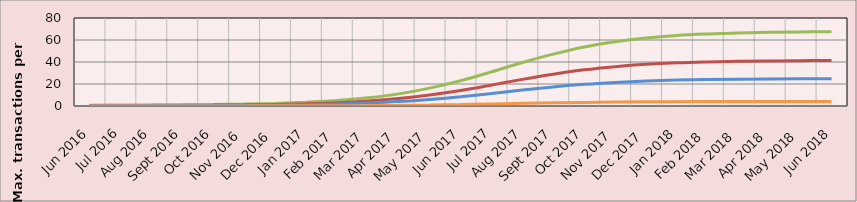
| Category | SUP A TPS | SUP B TPS | SUP C TPS | SUP D TPS |
|---|---|---|---|---|
| 2016-06-01 | 0.728 | 0.445 | 0.267 | 0.045 |
| 2016-07-01 | 0.864 | 0.529 | 0.317 | 0.053 |
| 2016-08-01 | 0.954 | 0.584 | 0.351 | 0.058 |
| 2016-09-01 | 1.098 | 0.672 | 0.403 | 0.067 |
| 2016-10-01 | 1.342 | 0.822 | 0.493 | 0.082 |
| 2016-11-01 | 1.728 | 1.058 | 0.635 | 0.106 |
| 2016-12-01 | 2.377 | 1.455 | 0.873 | 0.146 |
| 2017-01-01 | 3.429 | 2.099 | 1.259 | 0.21 |
| 2017-02-01 | 4.909 | 3.006 | 1.803 | 0.301 |
| 2017-03-01 | 7.412 | 4.538 | 2.723 | 0.454 |
| 2017-04-01 | 11.02 | 6.747 | 4.048 | 0.675 |
| 2017-05-01 | 16.277 | 9.965 | 5.979 | 0.997 |
| 2017-06-01 | 22.915 | 14.03 | 8.418 | 1.403 |
| 2017-07-01 | 31.013 | 18.987 | 11.392 | 1.899 |
| 2017-08-01 | 39.518 | 24.195 | 14.517 | 2.419 |
| 2017-09-01 | 47.155 | 28.87 | 17.322 | 2.887 |
| 2017-10-01 | 53.685 | 32.869 | 19.721 | 3.287 |
| 2017-11-01 | 58.441 | 35.78 | 21.468 | 3.578 |
| 2017-12-01 | 61.879 | 37.885 | 22.731 | 3.789 |
| 2018-01-01 | 64.15 | 39.275 | 23.565 | 3.928 |
| 2018-02-01 | 65.484 | 40.092 | 24.055 | 4.009 |
| 2018-03-01 | 66.428 | 40.671 | 24.402 | 4.067 |
| 2018-04-01 | 66.994 | 41.017 | 24.61 | 4.102 |
| 2018-05-01 | 67.354 | 41.237 | 24.742 | 4.124 |
| 2018-06-01 | 67.566 | 41.367 | 24.82 | 4.137 |